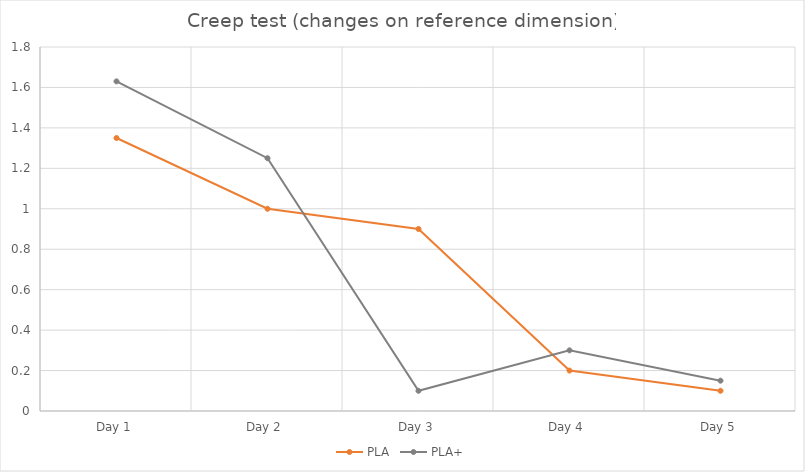
| Category | PLA | PLA+ |
|---|---|---|
| Day 1 | 1.35 | 1.63 |
| Day 2 | 1 | 1.25 |
| Day 3 | 0.9 | 0.1 |
| Day 4 | 0.2 | 0.3 |
| Day 5 | 0.1 | 0.15 |